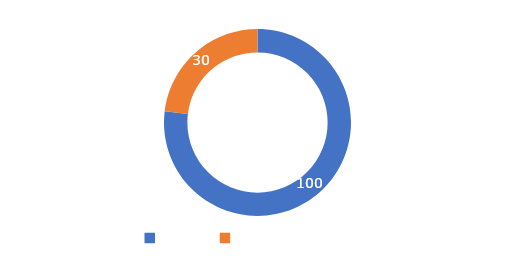
| Category | Series 0 |
|---|---|
| META  | 100 |
| CUMPLIMIENTO | 30 |